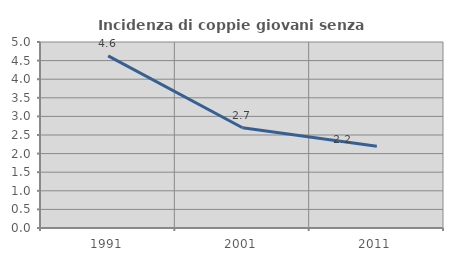
| Category | Incidenza di coppie giovani senza figli |
|---|---|
| 1991.0 | 4.628 |
| 2001.0 | 2.694 |
| 2011.0 | 2.197 |